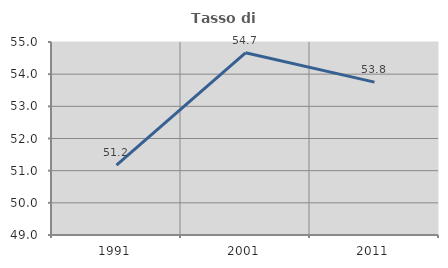
| Category | Tasso di occupazione   |
|---|---|
| 1991.0 | 51.174 |
| 2001.0 | 54.666 |
| 2011.0 | 53.752 |